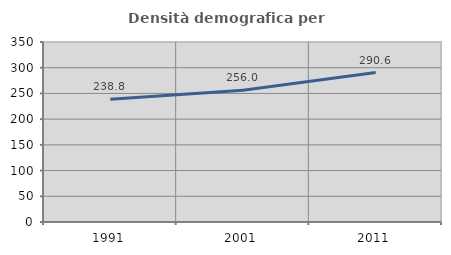
| Category | Densità demografica |
|---|---|
| 1991.0 | 238.762 |
| 2001.0 | 255.99 |
| 2011.0 | 290.611 |